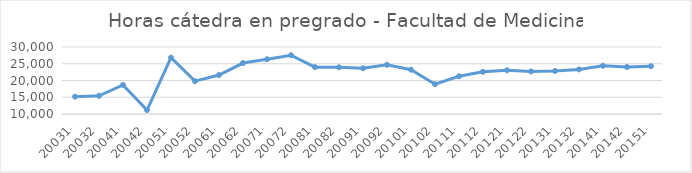
| Category | Total horas |
|---|---|
| 20031 | 15176 |
| 20032 | 15425 |
| 20041 | 18674 |
| 20042 | 11189 |
| 20051 | 26810 |
| 20052 | 19795 |
| 20061 | 21635 |
| 20062 | 25207 |
| 20071 | 26341 |
| 20072 | 27551 |
| 20081 | 23989 |
| 20082 | 23950 |
| 20091 | 23650 |
| 20092 | 24675 |
| 20101 | 23227 |
| 20102 | 18899 |
| 20111 | 21258 |
| 20112 | 22583 |
| 20121 | 23068 |
| 20122 | 22718 |
| 20131 | 22830 |
| 20132 | 23314 |
| 20141 | 24402 |
| 20142 | 24029 |
| 20151 | 24267 |